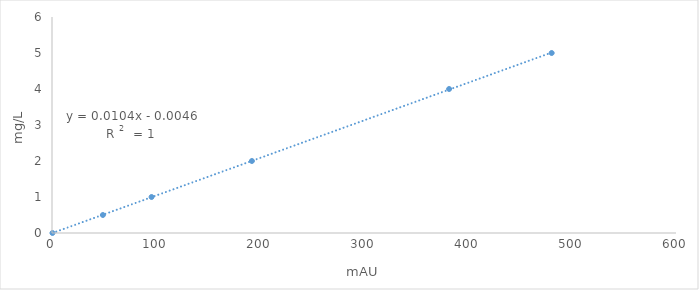
| Category | Series 0 |
|---|---|
| 0.45 | 0 |
| 48.931 | 0.5 |
| 95.736 | 1 |
| 192.207 | 2 |
| 381.839 | 4 |
| 480.443 | 5 |